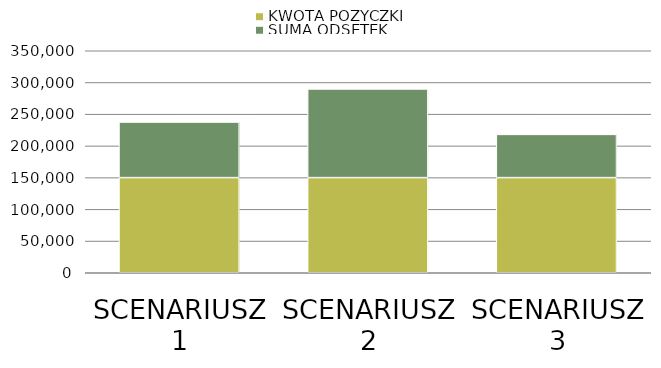
| Category | KWOTA POŻYCZKI | SUMA ODSETEK |
|---|---|---|
| SCENARIUSZ 1 | 150000 | 87584.066 |
| SCENARIUSZ 2 | 150000 | 139753.762 |
| SCENARIUSZ 3 | 150000 | 68152.919 |